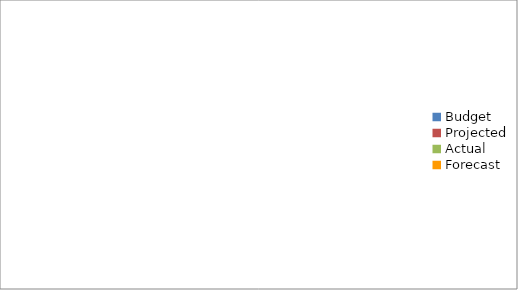
| Category | Series 0 |
|---|---|
| Budget | 2350 |
| Projected | 2040 |
| Actual | 1240 |
| Forecast | 3270 |